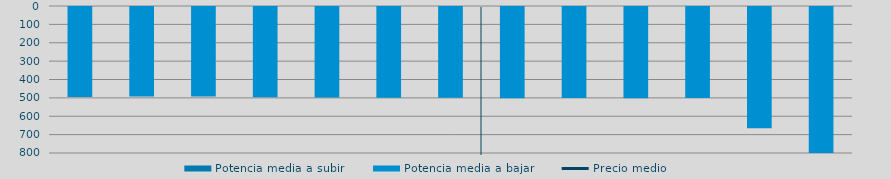
| Category | Potencia media a subir | Potencia media a bajar |
|---|---|---|
| 0 |  | 489.186 |
| 1 |  | 487.042 |
| 2 |  | 487.609 |
| 3 |  | 490.681 |
| 4 |  | 493.046 |
| 5 |  | 494.01 |
| 6 |  | 494.269 |
| 7 |  | 496 |
| 8 |  | 495.792 |
| 9 |  | 497.176 |
| 10 |  | 494.972 |
| 11 |  | 660 |
| 12 |  | 809.502 |